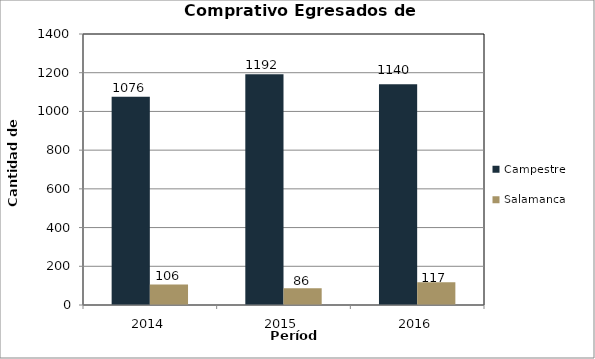
| Category | Campestre | Salamanca |
|---|---|---|
| 2014.0 | 1076 | 106 |
| 2015.0 | 1192 | 86 |
| 2016.0 | 1140 | 117 |